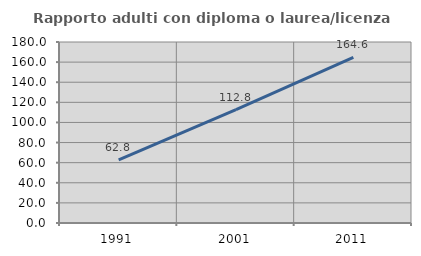
| Category | Rapporto adulti con diploma o laurea/licenza media  |
|---|---|
| 1991.0 | 62.831 |
| 2001.0 | 112.761 |
| 2011.0 | 164.606 |